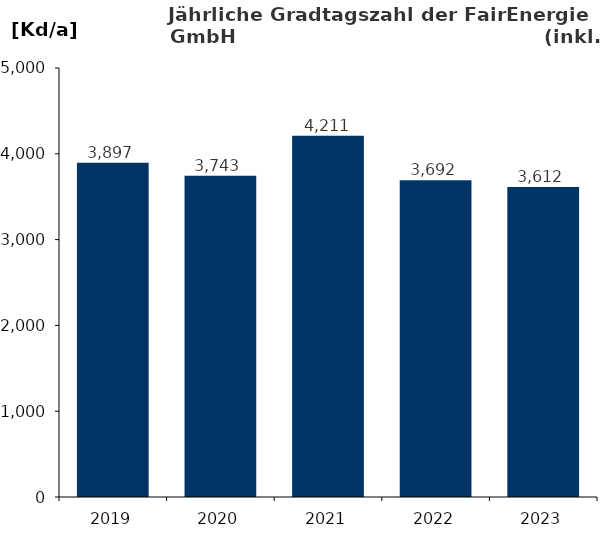
| Category | Gradtagszahl |
|---|---|
| 2019.0 | 3896.7 |
| 2020.0 | 3743 |
| 2021.0 | 4210.7 |
| 2022.0 | 3691.8 |
| 2023.0 | 3612 |